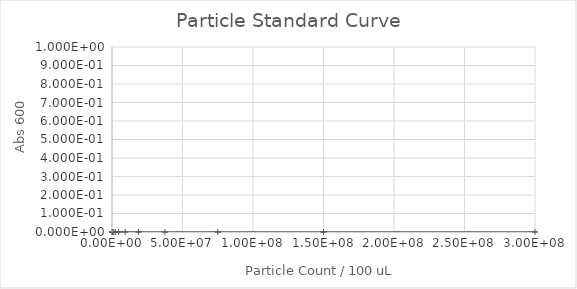
| Category | Series 0 |
|---|---|
| 300000000.0 | 0 |
| 150000000.0 | 0 |
| 75000000.0 | 0 |
| 37500000.0 | 0 |
| 18750000.0 | 0 |
| 9375000.0 | 0 |
| 4687500.0 | 0 |
| 2343750.0 | 0 |
| 1171875.0 | 0 |
| 585937.5 | 0 |
| 292968.75 | 0 |
| 0.0 | 0 |